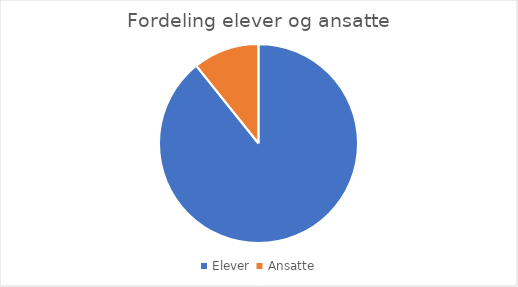
| Category | Series 0 |
|---|---|
| Elever  | 789 |
| Ansatte | 95 |